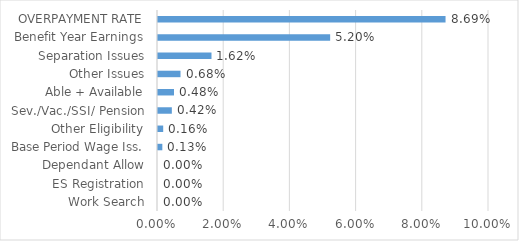
| Category | Series 0 |
|---|---|
| Work Search | 0 |
| ES Registration | 0 |
| Dependant Allow | 0 |
| Base Period Wage Iss. | 0.001 |
| Other Eligibility | 0.002 |
| Sev./Vac./SSI/ Pension | 0.004 |
| Able + Available | 0.005 |
| Other Issues | 0.007 |
| Separation Issues | 0.016 |
| Benefit Year Earnings | 0.052 |
| OVERPAYMENT RATE | 0.087 |